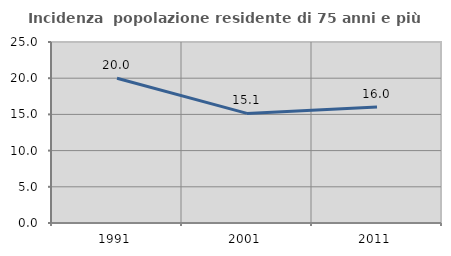
| Category | Incidenza  popolazione residente di 75 anni e più |
|---|---|
| 1991.0 | 20 |
| 2001.0 | 15.141 |
| 2011.0 | 16.013 |